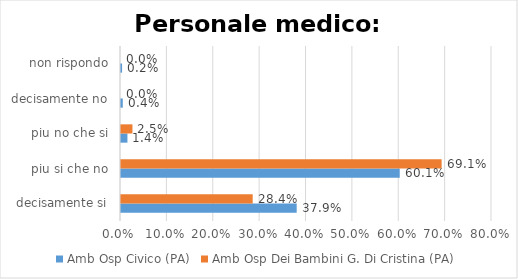
| Category | Amb Osp Civico (PA) | Amb Osp Dei Bambini G. Di Cristina (PA) |
|---|---|---|
| decisamente si | 0.379 | 0.284 |
| piu si che no | 0.601 | 0.691 |
| piu no che si | 0.014 | 0.025 |
| decisamente no | 0.004 | 0 |
| non rispondo | 0.002 | 0 |